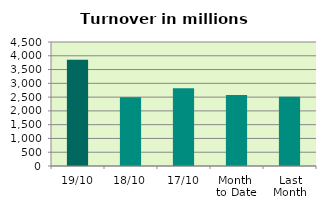
| Category | Series 0 |
|---|---|
| 19/10 | 3852.795 |
| 18/10 | 2497.75 |
| 17/10 | 2819.397 |
| Month 
to Date | 2572.577 |
| Last
Month | 2513.15 |